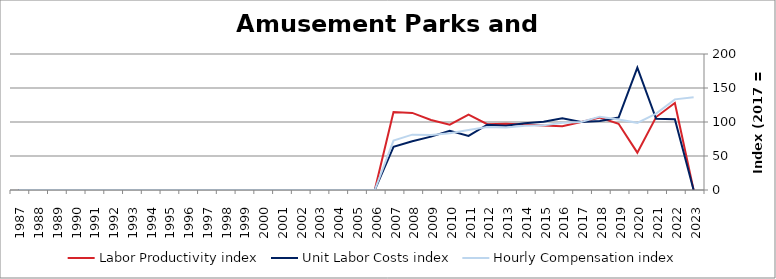
| Category | Labor Productivity index | Unit Labor Costs index | Hourly Compensation index |
|---|---|---|---|
| 2023.0 | 0 | 0 | 136.56 |
| 2022.0 | 127.903 | 104.21 | 133.287 |
| 2021.0 | 107.251 | 104.823 | 112.424 |
| 2020.0 | 54.913 | 179.837 | 98.755 |
| 2019.0 | 97.45 | 106.483 | 103.768 |
| 2018.0 | 106.465 | 101.323 | 107.873 |
| 2017.0 | 100 | 100 | 100 |
| 2016.0 | 93.918 | 105.459 | 99.044 |
| 2015.0 | 94.722 | 100.333 | 95.038 |
| 2014.0 | 96.202 | 98.236 | 94.505 |
| 2013.0 | 97.459 | 94.411 | 92.011 |
| 2012.0 | 96.71 | 95.945 | 92.788 |
| 2011.0 | 110.815 | 79.603 | 88.212 |
| 2010.0 | 95.994 | 86.997 | 83.512 |
| 2009.0 | 102.986 | 78.452 | 80.794 |
| 2008.0 | 113.404 | 71.773 | 81.394 |
| 2007.0 | 114.663 | 63.381 | 72.674 |
| 2006.0 | 0 | 0 | 0 |
| 2005.0 | 0 | 0 | 0 |
| 2004.0 | 0 | 0 | 0 |
| 2003.0 | 0 | 0 | 0 |
| 2002.0 | 0 | 0 | 0 |
| 2001.0 | 0 | 0 | 0 |
| 2000.0 | 0 | 0 | 0 |
| 1999.0 | 0 | 0 | 0 |
| 1998.0 | 0 | 0 | 0 |
| 1997.0 | 0 | 0 | 0 |
| 1996.0 | 0 | 0 | 0 |
| 1995.0 | 0 | 0 | 0 |
| 1994.0 | 0 | 0 | 0 |
| 1993.0 | 0 | 0 | 0 |
| 1992.0 | 0 | 0 | 0 |
| 1991.0 | 0 | 0 | 0 |
| 1990.0 | 0 | 0 | 0 |
| 1989.0 | 0 | 0 | 0 |
| 1988.0 | 0 | 0 | 0 |
| 1987.0 | 0 | 0 | 0 |